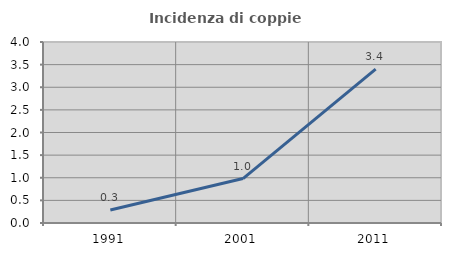
| Category | Incidenza di coppie miste |
|---|---|
| 1991.0 | 0.286 |
| 2001.0 | 0.982 |
| 2011.0 | 3.402 |